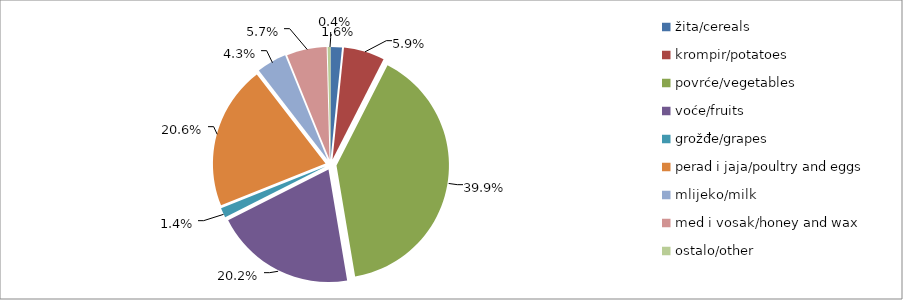
| Category | Series 0 |
|---|---|
| žita/cereals | 22722 |
| krompir/potatoes | 81422 |
| povrće/vegetables | 553846.5 |
| voće/fruits | 280474 |
| grožđe/grapes | 19592 |
| perad i jaja/poultry and eggs | 286399.5 |
| mlijeko/milk | 59739 |
| med i vosak/honey and wax | 79800 |
| ostalo/other | 5660 |